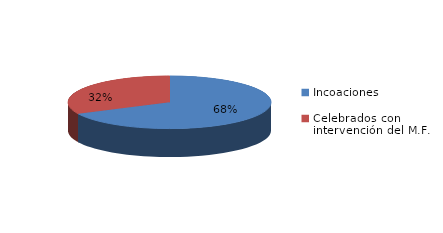
| Category | Series 0 |
|---|---|
| Incoaciones | 6319 |
| Celebrados con intervención del M.F. | 3000 |